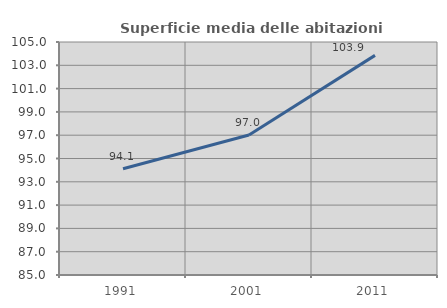
| Category | Superficie media delle abitazioni occupate |
|---|---|
| 1991.0 | 94.122 |
| 2001.0 | 97.018 |
| 2011.0 | 103.851 |